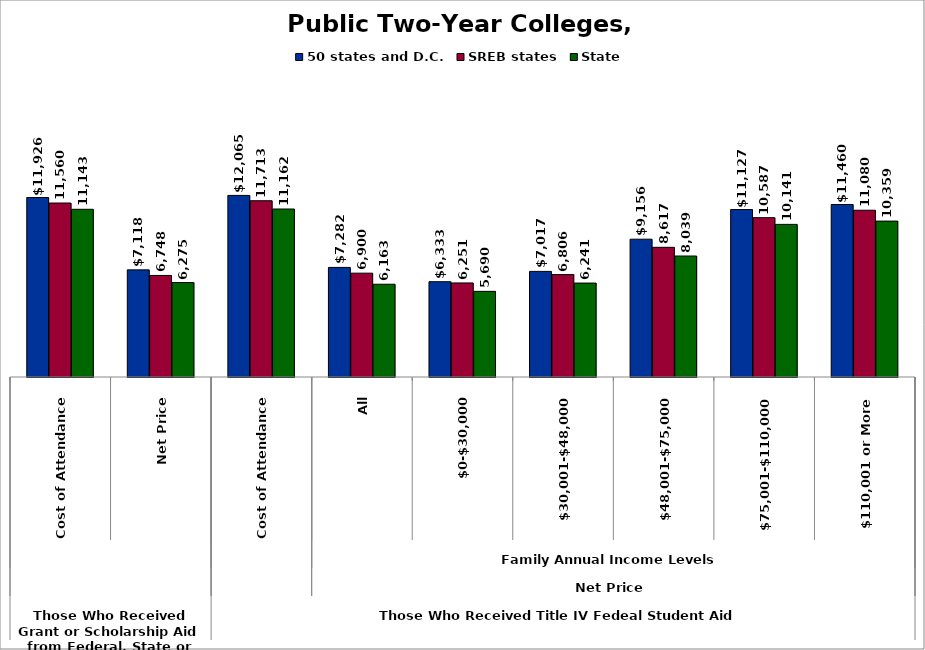
| Category | 50 states and D.C. | SREB states | State |
|---|---|---|---|
| 0 | 11926.495 | 11559.584 | 11143.151 |
| 1 | 7118.35 | 6747.515 | 6274.671 |
| 2 | 12065.015 | 11712.622 | 11161.817 |
| 3 | 7281.665 | 6899.558 | 6163.055 |
| 4 | 6332.809 | 6250.621 | 5689.604 |
| 5 | 7016.698 | 6806.167 | 6241.354 |
| 6 | 9156.337 | 8616.76 | 8039.213 |
| 7 | 11127.174 | 10587.437 | 10141.143 |
| 8 | 11460.469 | 11080 | 10359.122 |